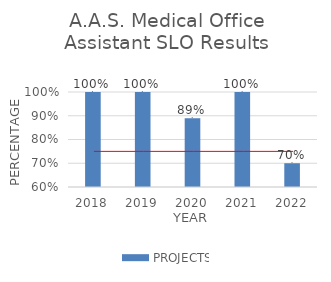
| Category | PROJECTS |
|---|---|
| 0 | 1 |
| 1 | 1 |
| 2 | 0.89 |
| 3 | 1 |
| 4 | 0.7 |